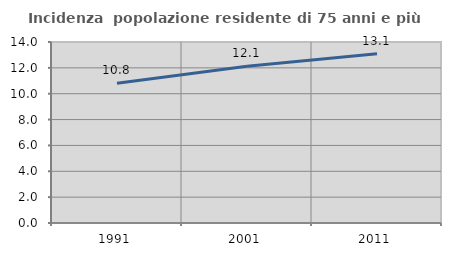
| Category | Incidenza  popolazione residente di 75 anni e più |
|---|---|
| 1991.0 | 10.811 |
| 2001.0 | 12.121 |
| 2011.0 | 13.095 |